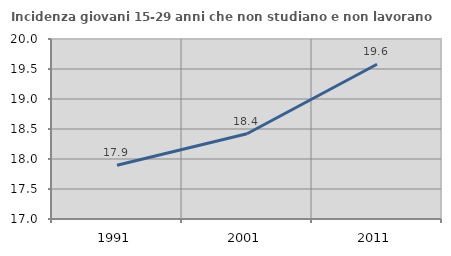
| Category | Incidenza giovani 15-29 anni che non studiano e non lavorano  |
|---|---|
| 1991.0 | 17.895 |
| 2001.0 | 18.421 |
| 2011.0 | 19.579 |